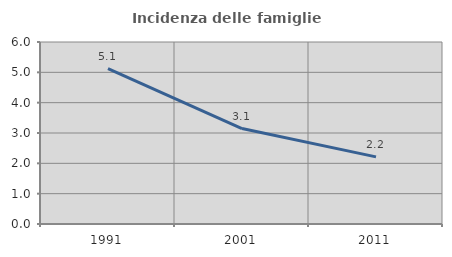
| Category | Incidenza delle famiglie numerose |
|---|---|
| 1991.0 | 5.125 |
| 2001.0 | 3.146 |
| 2011.0 | 2.212 |